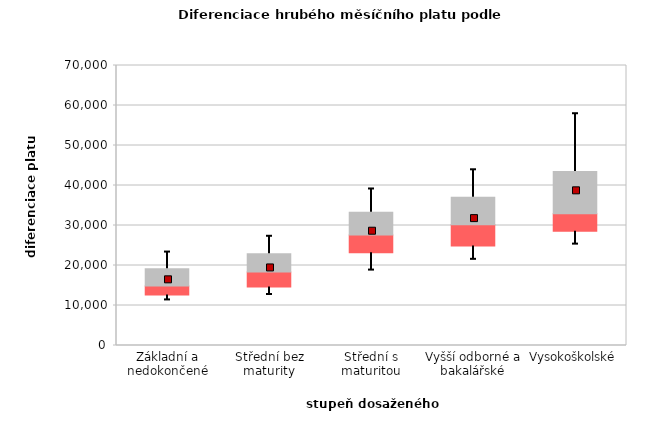
| Category | 0,25 | 0,5 | 0,75 |
|---|---|---|---|
| Základní a nedokončené | 12597.667 | 2283.333 | 4277.854 |
| Střední bez maturity | 14633.603 | 3741.897 | 4552.334 |
| Střední s maturitou | 23199.23 | 4431.228 | 5687.903 |
| Vyšší odborné a bakalářské | 24878.994 | 5336.329 | 6820.244 |
| Vysokoškolské | 28582.391 | 4343.855 | 10585.568 |